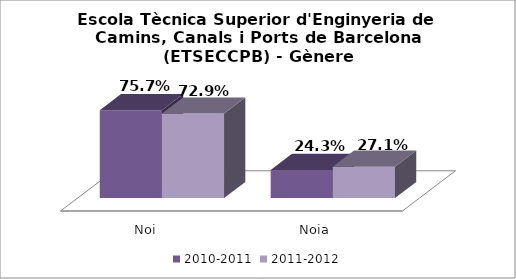
| Category | 2010-2011 | 2011-2012 |
|---|---|---|
| Noi | 0.757 | 0.729 |
| Noia | 0.243 | 0.271 |